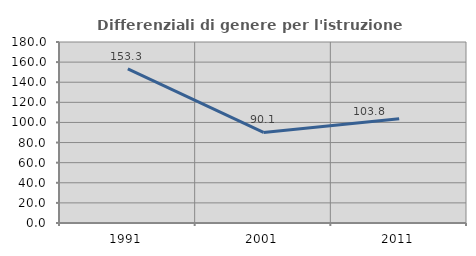
| Category | Differenziali di genere per l'istruzione superiore |
|---|---|
| 1991.0 | 153.341 |
| 2001.0 | 90.055 |
| 2011.0 | 103.769 |